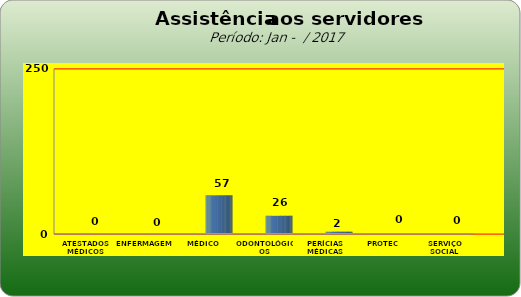
| Category | Series 0 |
|---|---|
| ATESTADOS MÉDICOS | 0 |
| ENFERMAGEM | 0 |
| MÉDICO | 57 |
| ODONTOLÓGICOS | 26 |
| PERÍCIAS MÉDICAS | 2 |
| PROTEC | 0 |
| SERVIÇO SOCIAL | 0 |